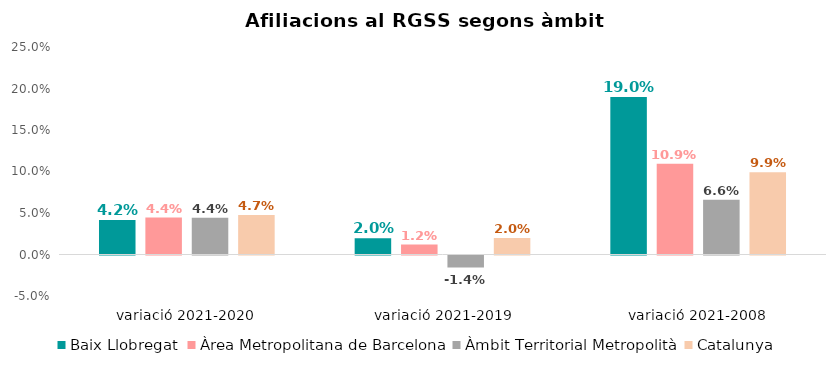
| Category | Baix Llobregat | Àrea Metropolitana de Barcelona | Àmbit Territorial Metropolità | Catalunya |
|---|---|---|---|---|
| variació 2021-2020 | 0.042 | 0.044 | 0.044 | 0.047 |
|  variació 2021-2019 | 0.02 | 0.012 | -0.014 | 0.02 |
| variació 2021-2008 | 0.19 | 0.109 | 0.066 | 0.099 |